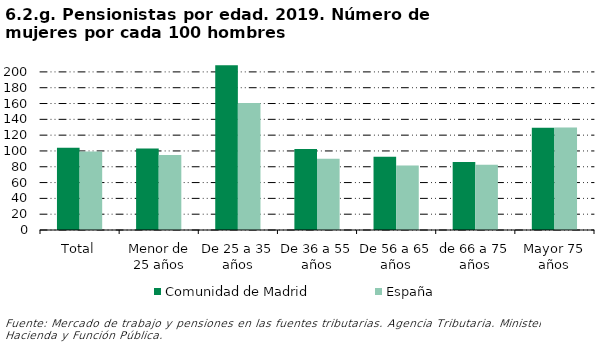
| Category | Comunidad de Madrid | España |
|---|---|---|
| Total | 104.09 | 99.44 |
| Menor de 25 años | 103.02 | 94.741 |
| De 25 a 35 años | 208.446 | 160.719 |
| De 36 a 55 años | 102.49 | 90.081 |
| De 56 a 65 años | 92.557 | 81.555 |
| de 66 a 75 años | 86.069 | 82.408 |
| Mayor 75 años | 129.305 | 129.672 |